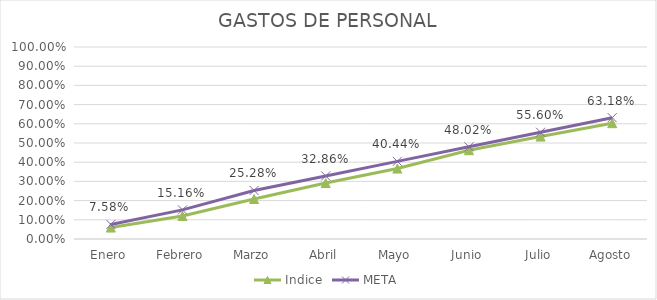
| Category | Indice | META |
|---|---|---|
| Enero | 0.06 | 0.076 |
| Febrero | 0.12 | 0.152 |
| Marzo | 0.208 | 0.253 |
| Abril | 0.291 | 0.329 |
| Mayo | 0.367 | 0.404 |
| Junio | 0.462 | 0.48 |
| Julio | 0.533 | 0.556 |
| Agosto | 0.603 | 0.632 |